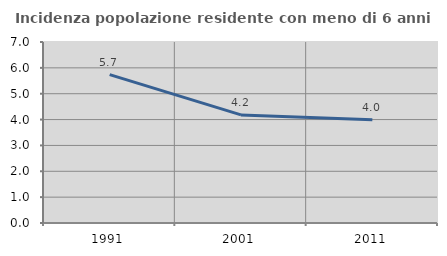
| Category | Incidenza popolazione residente con meno di 6 anni |
|---|---|
| 1991.0 | 5.736 |
| 2001.0 | 4.182 |
| 2011.0 | 3.997 |